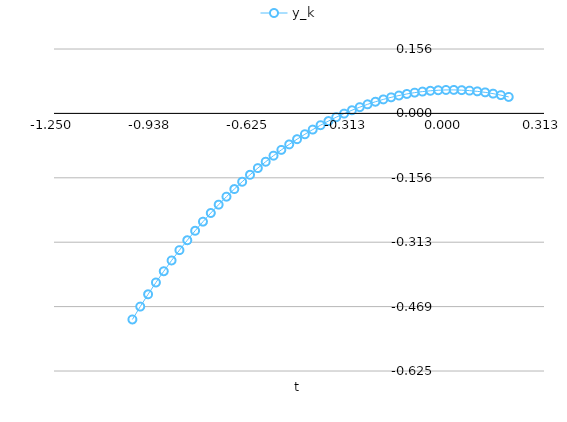
| Category | y_k |
|---|---|
| -1.0 | -0.5 |
| -0.975 | -0.469 |
| -0.95 | -0.439 |
| -0.925 | -0.41 |
| -0.9 | -0.383 |
| -0.875 | -0.357 |
| -0.85 | -0.332 |
| -0.825 | -0.308 |
| -0.8 | -0.285 |
| -0.775 | -0.263 |
| -0.75 | -0.242 |
| -0.725 | -0.221 |
| -0.7 | -0.202 |
| -0.675 | -0.184 |
| -0.65 | -0.166 |
| -0.625 | -0.149 |
| -0.6 | -0.133 |
| -0.575 | -0.117 |
| -0.55 | -0.103 |
| -0.525 | -0.089 |
| -0.5 | -0.075 |
| -0.475 | -0.063 |
| -0.45 | -0.051 |
| -0.425 | -0.039 |
| -0.4 | -0.029 |
| -0.375 | -0.019 |
| -0.35 | -0.009 |
| -0.325 | 0 |
| -0.3 | 0.008 |
| -0.275 | 0.015 |
| -0.25 | 0.022 |
| -0.225 | 0.028 |
| -0.2 | 0.034 |
| -0.175 | 0.039 |
| -0.15 | 0.043 |
| -0.125 | 0.047 |
| -0.1 | 0.05 |
| -0.075 | 0.053 |
| -0.05 | 0.055 |
| -0.025 | 0.056 |
| 0.0 | 0.057 |
| 0.025 | 0.057 |
| 0.05 | 0.056 |
| 0.075 | 0.055 |
| 0.1 | 0.053 |
| 0.125 | 0.051 |
| 0.15 | 0.048 |
| 0.175 | 0.044 |
| 0.2 | 0.04 |